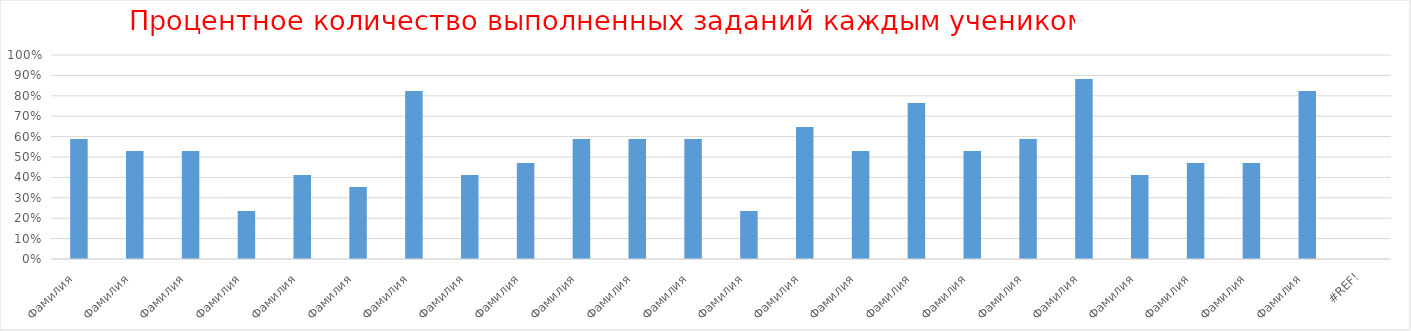
| Category | Series 0 |
|---|---|
| Фамилия  | 0.588 |
| Фамилия  | 0.529 |
| Фамилия  | 0.529 |
| Фамилия  | 0.235 |
| Фамилия  | 0.412 |
| Фамилия  | 0.353 |
| Фамилия  | 0.824 |
| Фамилия  | 0.412 |
| Фамилия  | 0.471 |
| Фамилия  | 0.588 |
| Фамилия  | 0.588 |
| Фамилия  | 0.588 |
| Фамилия  | 0.235 |
| Фамилия  | 0.647 |
| Фамилия  | 0.529 |
| Фамилия  | 0.765 |
| Фамилия  | 0.529 |
| Фамилия  | 0.588 |
| Фамилия  | 0.882 |
| Фамилия  | 0.412 |
| Фамилия  | 0.471 |
| Фамилия  | 0.471 |
| Фамилия  | 0.824 |
| #ССЫЛКА! | 0 |